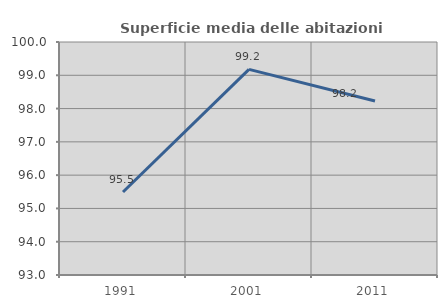
| Category | Superficie media delle abitazioni occupate |
|---|---|
| 1991.0 | 95.493 |
| 2001.0 | 99.178 |
| 2011.0 | 98.226 |